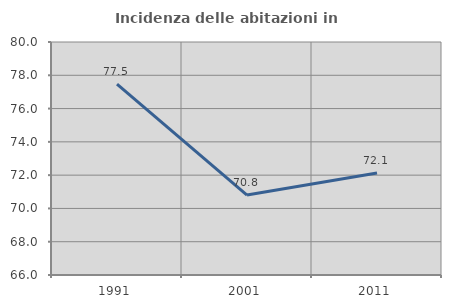
| Category | Incidenza delle abitazioni in proprietà  |
|---|---|
| 1991.0 | 77.471 |
| 2001.0 | 70.803 |
| 2011.0 | 72.134 |